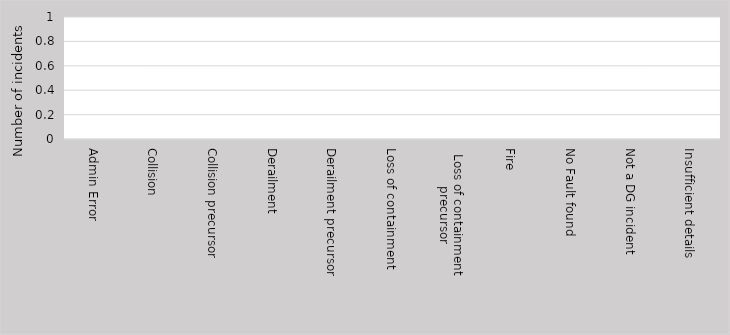
| Category | Series 0 |
|---|---|
| Admin Error | 0 |
| Collision | 0 |
| Collision precursor | 0 |
| Derailment | 0 |
| Derailment precursor | 0 |
| Loss of containment | 0 |
| Loss of containment
precursor | 0 |
| Fire | 0 |
| No Fault found | 0 |
| Not a DG incident | 0 |
| Insufficient details | 0 |